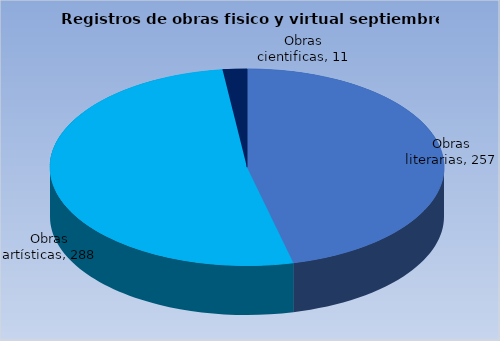
| Category | Series 0 |
|---|---|
| Obras literarias | 257 |
| Obras artísticas | 288 |
| Obras cientificas | 11 |